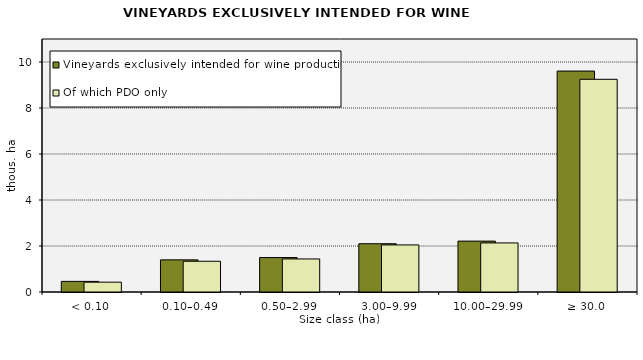
| Category | Vineyards exclusively intended for wine production | Of which PDO only  |
|---|---|---|
| < 0.10 | 461.553 | 427.838 |
| 0.10–0.49 | 1396.771 | 1336.376 |
| 0.50–2.99 | 1497.339 | 1437.142 |
| 3.00–9.99 | 2099.008 | 2047.448 |
| 10.00–29.99 | 2212.199 | 2133.706 |
| ≥ 30.0 | 9605.621 | 9247.53 |